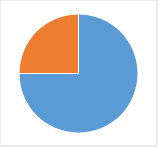
| Category | Series 0 |
|---|---|
| 0 | 0.729 |
| 1 | 0.243 |
| 2 | 0 |